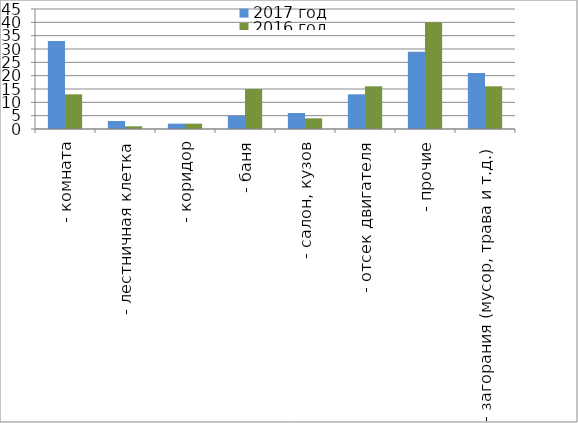
| Category | 2017 год | 2016 год |
|---|---|---|
|  - комната | 33 | 13 |
|  - лестничная клетка | 3 | 1 |
|  - коридор | 2 | 2 |
|  - баня | 5 | 15 |
|  - салон, кузов | 6 | 4 |
|  - отсек двигателя | 13 | 16 |
| - прочие | 29 | 40 |
| - загорания (мусор, трава и т.д.)  | 21 | 16 |